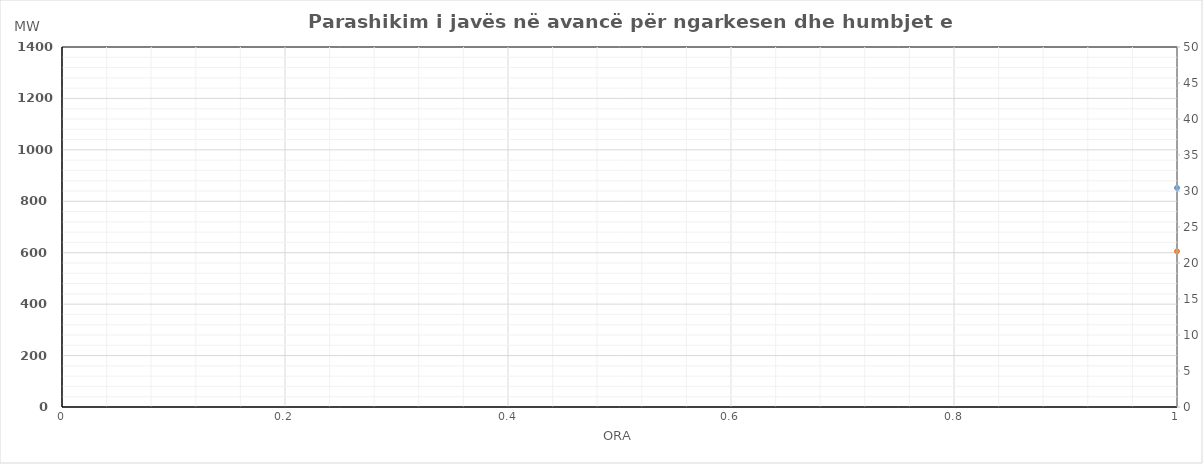
| Category | Ngarkesa (MWh) |
|---|---|
| 0 | 605.547 |
| 1 | 558.061 |
| 2 | 534.052 |
| 3 | 545.583 |
| 4 | 567.354 |
| 5 | 563.268 |
| 6 | 618.612 |
| 7 | 732.201 |
| 8 | 863.398 |
| 9 | 969.549 |
| 10 | 1033.263 |
| 11 | 1065.78 |
| 12 | 1078.591 |
| 13 | 1046.201 |
| 14 | 1016.375 |
| 15 | 1001.7 |
| 16 | 1009.031 |
| 17 | 1033.457 |
| 18 | 1078.623 |
| 19 | 1161.859 |
| 20 | 1181.473 |
| 21 | 1098.781 |
| 22 | 900 |
| 23 | 757.938 |
| 24 | 632.466 |
| 25 | 561.965 |
| 26 | 538.285 |
| 27 | 550.77 |
| 28 | 569.107 |
| 29 | 577.208 |
| 30 | 690 |
| 31 | 824.72 |
| 32 | 932.458 |
| 33 | 965.18 |
| 34 | 948.061 |
| 35 | 916.757 |
| 36 | 896.867 |
| 37 | 882.839 |
| 38 | 889.899 |
| 39 | 867.647 |
| 40 | 857.15 |
| 41 | 880.63 |
| 42 | 932.5 |
| 43 | 1007.998 |
| 44 | 1030.062 |
| 45 | 961.259 |
| 46 | 842.789 |
| 47 | 712.219 |
| 48 | 595.547 |
| 49 | 548.061 |
| 50 | 524.052 |
| 51 | 535.583 |
| 52 | 557.354 |
| 53 | 553.268 |
| 54 | 608.612 |
| 55 | 722.201 |
| 56 | 853.398 |
| 57 | 959.549 |
| 58 | 1023.263 |
| 59 | 1055.78 |
| 60 | 1068.591 |
| 61 | 1036.201 |
| 62 | 1006.375 |
| 63 | 991.7 |
| 64 | 999.031 |
| 65 | 1023.457 |
| 66 | 1068.623 |
| 67 | 1151.859 |
| 68 | 1171.473 |
| 69 | 1001 |
| 70 | 900 |
| 71 | 747.938 |
| 72 | 637.466 |
| 73 | 566.965 |
| 74 | 543.285 |
| 75 | 555.77 |
| 76 | 574.107 |
| 77 | 582.208 |
| 78 | 684.486 |
| 79 | 829.72 |
| 80 | 937.458 |
| 81 | 970.18 |
| 82 | 953.061 |
| 83 | 921.757 |
| 84 | 901.867 |
| 85 | 887.839 |
| 86 | 894.899 |
| 87 | 872.647 |
| 88 | 862.15 |
| 89 | 885.63 |
| 90 | 937.5 |
| 91 | 1012.998 |
| 92 | 1035.062 |
| 93 | 966.259 |
| 94 | 847.789 |
| 95 | 717.219 |
| 96 | 627.817 |
| 97 | 563.753 |
| 98 | 536.449 |
| 99 | 560.662 |
| 100 | 588.17 |
| 101 | 602.137 |
| 102 | 704.835 |
| 103 | 830 |
| 104 | 974.351 |
| 105 | 953.213 |
| 106 | 908.268 |
| 107 | 884.147 |
| 108 | 869.875 |
| 109 | 872.556 |
| 110 | 888.913 |
| 111 | 861.57 |
| 112 | 860.575 |
| 113 | 873.762 |
| 114 | 936.912 |
| 115 | 1024.145 |
| 116 | 1067.611 |
| 117 | 1001.714 |
| 118 | 883.396 |
| 119 | 739.237 |
| 120 | 632.817 |
| 121 | 568.753 |
| 122 | 541.449 |
| 123 | 565.662 |
| 124 | 593.17 |
| 125 | 607.137 |
| 126 | 709.835 |
| 127 | 830 |
| 128 | 979.351 |
| 129 | 958.213 |
| 130 | 913.268 |
| 131 | 889.147 |
| 132 | 874.875 |
| 133 | 877.556 |
| 134 | 893.913 |
| 135 | 866.57 |
| 136 | 865.575 |
| 137 | 878.762 |
| 138 | 941.912 |
| 139 | 1029.145 |
| 140 | 1072.611 |
| 141 | 1006.714 |
| 142 | 888.396 |
| 143 | 744.237 |
| 144 | 637.466 |
| 145 | 566.965 |
| 146 | 543.285 |
| 147 | 555.77 |
| 148 | 574.107 |
| 149 | 582.208 |
| 150 | 684.486 |
| 151 | 829.72 |
| 152 | 937.458 |
| 153 | 970.18 |
| 154 | 953.061 |
| 155 | 921.757 |
| 156 | 901.867 |
| 157 | 887.839 |
| 158 | 894.899 |
| 159 | 872.647 |
| 160 | 862.15 |
| 161 | 885.63 |
| 162 | 937.5 |
| 163 | 1012.998 |
| 164 | 1035.062 |
| 165 | 966.259 |
| 166 | 847.789 |
| 167 | 717.219 |